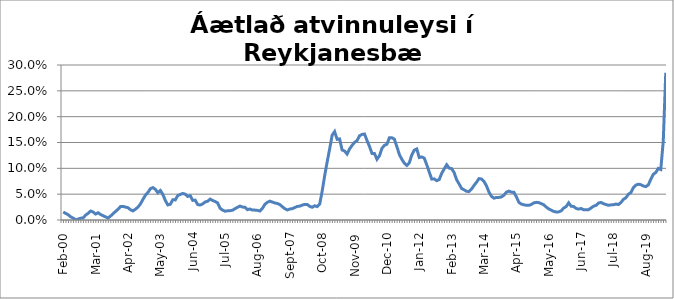
| Category | Series 0 |
|---|---|
| feb.00 | 0.015 |
| mar.00 | 0.013 |
| apr.00 | 0.01 |
| maí.00 | 0.006 |
| jún.00 | 0.004 |
| júl.00 | 0 |
| ágú.00 | 0.002 |
| sep.00 | 0.003 |
| okt.00 | 0.004 |
| nóv.00 | 0.009 |
| des.00 | 0.013 |
| jan.01 | 0.017 |
| feb.01 | 0.015 |
| mar.01 | 0.012 |
| apr.01 | 0.014 |
| maí.01 | 0.011 |
| jún.01 | 0.008 |
| júl.01 | 0.006 |
| ágú.01 | 0.004 |
| sep.01 | 0.008 |
| okt.01 | 0.012 |
| nóv.01 | 0.016 |
| des.01 | 0.021 |
| jan.02 | 0.026 |
| feb.02 | 0.026 |
| mar.02 | 0.025 |
| apr.02 | 0.024 |
| maí.02 | 0.02 |
| jún.02 | 0.018 |
| júl.02 | 0.021 |
| ágú.02 | 0.025 |
| sep.02 | 0.031 |
| okt.02 | 0.04 |
| nóv.02 | 0.048 |
| des.02 | 0.053 |
| jan.03 | 0.061 |
| feb.03 | 0.063 |
| mar.03 | 0.059 |
| apr.03 | 0.053 |
| maí.03 | 0.057 |
| jún.03 | 0.05 |
| júl.03 | 0.038 |
| ágú.03 | 0.029 |
| sep.03 | 0.03 |
| okt.03 | 0.039 |
| nóv.03 | 0.039 |
| des.03 | 0.047 |
| jan.04 | 0.049 |
| feb.04 | 0.051 |
| mar.04 | 0.05 |
| apr.04 | 0.046 |
| maí.04 | 0.047 |
| jún.04 | 0.038 |
| júl.04 | 0.038 |
| ágú.04 | 0.03 |
| sep.04 | 0.029 |
| okt.04 | 0.031 |
| nóv.04 | 0.035 |
| des.04 | 0.036 |
| jan.05 | 0.04 |
| feb.05 | 0.038 |
| mar.05 | 0.036 |
| apr.05 | 0.033 |
| maí.05 | 0.023 |
| jún.05 | 0.019 |
| júl.05 | 0.017 |
| ágú.05 | 0.018 |
| sep.05 | 0.018 |
| okt.05 | 0.019 |
| nóv.05 | 0.022 |
| des.05 | 0.025 |
| jan.06 | 0.027 |
| feb.06 | 0.025 |
| mar.06 | 0.025 |
| apr.06 | 0.02 |
| maí.06 | 0.021 |
| jún.06 | 0.019 |
| júl.06 | 0.019 |
| ágú.06 | 0.019 |
| sep.06 | 0.017 |
| okt.06 | 0.022 |
| nóv.06 | 0.03 |
| des.06 | 0.034 |
| jan.07 | 0.037 |
| feb.07 | 0.035 |
| mar.07 | 0.033 |
| apr.07 | 0.032 |
| maí.07 | 0.03 |
| jún.07 | 0.026 |
| júl.07 | 0.022 |
| ágú.07 | 0.019 |
| sep.07 | 0.021 |
| okt.07 | 0.022 |
| nóv.07 | 0.024 |
| des.07 | 0.026 |
| jan.08 | 0.027 |
| feb.08 | 0.029 |
| mar.08 | 0.03 |
| apr.08 | 0.03 |
| maí.08 | 0.026 |
| jún.08 | 0.025 |
| júl.08 | 0.028 |
| ágú.08 | 0.026 |
| sep.08 | 0.031 |
| okt.08 | 0.056 |
| nóv.08 | 0.086 |
| des.08 | 0.112 |
| jan.09 | 0.137 |
| feb.09 | 0.164 |
| mar.09 | 0.171 |
| apr.09 | 0.156 |
| maí.09 | 0.157 |
| jún.09 | 0.136 |
| júl.09 | 0.134 |
| ágú.09 | 0.128 |
| sep.09 | 0.137 |
| okt.09 | 0.144 |
| nóv.09 | 0.15 |
| des.09 | 0.154 |
| jan.10 | 0.163 |
| feb.10 | 0.166 |
| mar.10 | 0.166 |
| apr.10 | 0.154 |
| maí.10 | 0.143 |
| jún.10 | 0.129 |
| júl.10 | 0.129 |
| ágú.10 | 0.117 |
| sep.10 | 0.124 |
| okt.10 | 0.139 |
| nóv.10 | 0.145 |
| des.10 | 0.147 |
| jan.11 | 0.159 |
| feb.11 | 0.159 |
| mar.11 | 0.156 |
| apr.11 | 0.142 |
| maí.11 | 0.127 |
| jún.11 | 0.117 |
| júl.11 | 0.11 |
| ágú.11 | 0.106 |
| sep.11 | 0.111 |
| okt.11 | 0.126 |
| nóv.11 | 0.135 |
| des.11 | 0.137 |
| jan.12 | 0.121 |
| feb.12 | 0.122 |
| mar.12 | 0.12 |
| apr.12 | 0.107 |
| maí.12 | 0.093 |
| jún.12 | 0.079 |
| júl.12 | 0.08 |
| ágú.12 | 0.076 |
| sep.12 | 0.078 |
| okt.12 | 0.09 |
| nóv.12 | 0.099 |
| des.12 | 0.107 |
| jan.13 | 0.1 |
| feb.13 | 0.099 |
| mar.13 | 0.092 |
| apr.13 | 0.078 |
| maí.13 | 0.07 |
| jún.13 | 0.061 |
| júl.13 | 0.058 |
| ágú.13 | 0.055 |
| sep.13 | 0.055 |
| okt.13 | 0.06 |
| nóv.13 | 0.067 |
| des.13 | 0.073 |
| jan.14* | 0.08 |
| feb.14 | 0.079 |
| mar.14 | 0.075 |
| apr.14 | 0.066 |
| maí.14 | 0.054 |
| jún.14 | 0.046 |
| júl.14 | 0.042 |
| ágú.14 | 0.044 |
| sep.14 | 0.044 |
| okt.14 | 0.045 |
| nóv.14 | 0.048 |
| des.14 | 0.054 |
| jan.15 | 0.056 |
| feb.15 | 0.054 |
| mar.15 | 0.054 |
| apr.15 | 0.045 |
| maí.15 | 0.034 |
| jún.15 | 0.031 |
| júl.15 | 0.03 |
| ágú.15 | 0.028 |
| sep.15 | 0.028 |
| okt.15 | 0.03 |
| nóv.15 | 0.033 |
| des.15 | 0.034 |
| jan.16 | 0.034 |
| feb.16 | 0.032 |
| mar.16 | 0.029 |
| apr.16 | 0.025 |
| maí.16 | 0.021 |
| jún.16 | 0.019 |
| júl.16 | 0.017 |
| ágú.16 | 0.016 |
| sep.16 | 0.016 |
| okt.16 | 0.018 |
| nóv.16 | 0.023 |
| des.16 | 0.026 |
| jan.17 | 0.033 |
| feb.17 | 0.027 |
| mar.17 | 0.026 |
| apr.17 | 0.022 |
| maí.17 | 0.021 |
| jún.17 | 0.022 |
| júl.17 | 0.02 |
| ágú.17 | 0.02 |
| sep.17 | 0.02 |
| okt.17 | 0.023 |
| nóv.17 | 0.027 |
| des.17 | 0.028 |
| jan.18 | 0.033 |
| feb.18 | 0.034 |
| mar.18 | 0.031 |
| apr.18 | 0.03 |
| maí.18 | 0.028 |
| jún.18 | 0.029 |
| júl.18 | 0.03 |
| ágú.18 | 0.031 |
| sep.18 | 0.03 |
| okt.18 | 0.034 |
| nóv.18 | 0.04 |
| des.18 | 0.043 |
| jan.19 | 0.05 |
| feb.19 | 0.053 |
| mar.19 | 0.063 |
| apr.19 | 0.068 |
| maí.19 | 0.069 |
| jún.19 | 0.068 |
| júl.19 | 0.066 |
| ágú.19 | 0.065 |
| sep.19 | 0.068 |
| okt.19 | 0.079 |
| nóv.19 | 0.088 |
| des.19 | 0.092 |
| jan.20 | 0.1 |
| feb.20 | 0.098 |
| mars 2020*** | 0.153 |
| apr.20 | 0.285 |